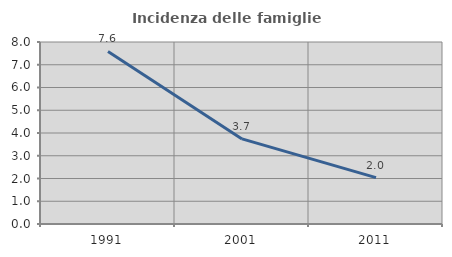
| Category | Incidenza delle famiglie numerose |
|---|---|
| 1991.0 | 7.583 |
| 2001.0 | 3.74 |
| 2011.0 | 2.04 |